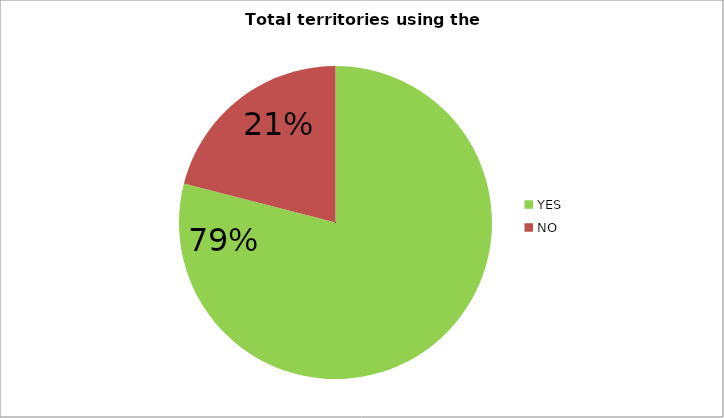
| Category | Total territories using the portal  |
|---|---|
| YES | 0.79 |
| NO | 0.21 |